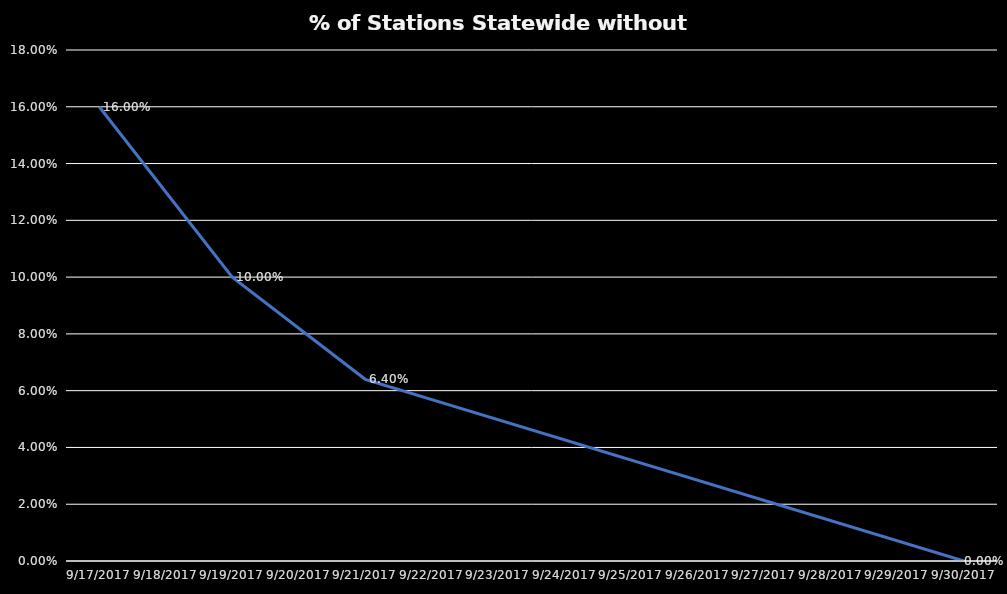
| Category | % of stations without fuel |
|---|---|
| 9/17/17 | 0.16 |
| 9/19/17 | 0.1 |
| 9/21/17 | 0.064 |
| 9/30/17 | 0 |